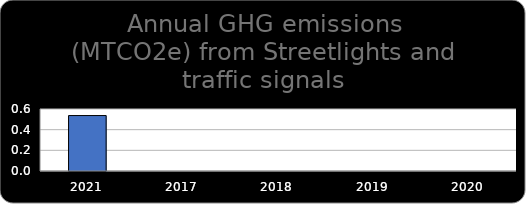
| Category | Series 0 |
|---|---|
| 2021.0 | 0.537 |
| 2017.0 | 0 |
| 2018.0 | 0 |
| 2019.0 | 0 |
| 2020.0 | 0 |